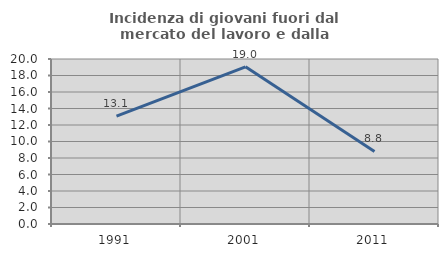
| Category | Incidenza di giovani fuori dal mercato del lavoro e dalla formazione  |
|---|---|
| 1991.0 | 13.064 |
| 2001.0 | 19.048 |
| 2011.0 | 8.796 |